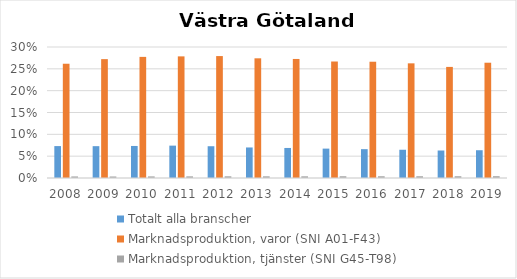
| Category | Totalt alla branscher | Marknadsproduktion, varor (SNI A01-F43) | Marknadsproduktion, tjänster (SNI G45-T98) |
|---|---|---|---|
| 2008.0 | 0.073 | 0.262 | 0.004 |
| 2009.0 | 0.073 | 0.272 | 0.003 |
| 2010.0 | 0.073 | 0.277 | 0.004 |
| 2011.0 | 0.074 | 0.279 | 0.004 |
| 2012.0 | 0.073 | 0.279 | 0.004 |
| 2013.0 | 0.07 | 0.274 | 0.004 |
| 2014.0 | 0.069 | 0.273 | 0.004 |
| 2015.0 | 0.067 | 0.267 | 0.004 |
| 2016.0 | 0.066 | 0.266 | 0.004 |
| 2017.0 | 0.065 | 0.263 | 0.004 |
| 2018.0 | 0.063 | 0.254 | 0.004 |
| 2019.0 | 0.064 | 0.264 | 0.004 |